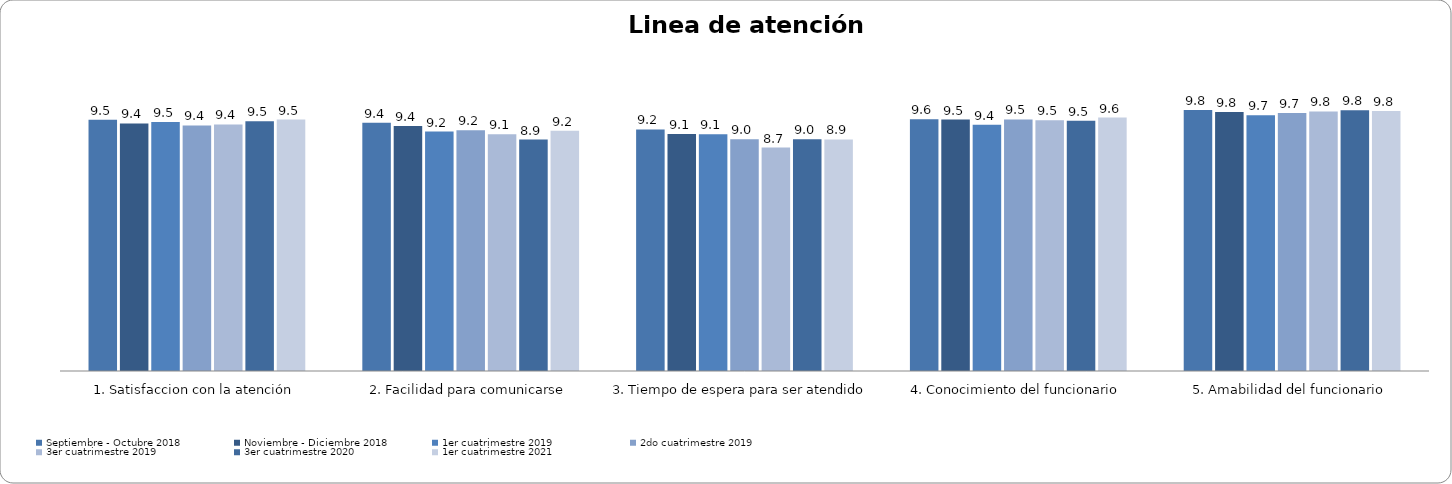
| Category | Septiembre - Octubre 2018 | Noviembre - Diciembre 2018 | 1er cuatrimestre 2019 | 2do cuatrimestre 2019 | 3er cuatrimestre 2019 | 3er cuatrimestre 2020 | 1er cuatrimestre 2021 |
|---|---|---|---|---|---|---|---|
| 1. Satisfaccion con la atención | 9.54 | 9.425 | 9.471 | 9.366 | 9.397 | 9.495 | 9.543 |
| 2. Facilidad para comunicarse | 9.448 | 9.353 | 9.182 | 9.219 | 9.102 | 8.944 | 9.206 |
| 3. Tiempo de espera para ser atendido | 9.249 | 9.112 | 9.102 | 8.955 | 8.704 | 8.955 | 8.947 |
| 4. Conocimiento del funcionario | 9.556 | 9.543 | 9.39 | 9.545 | 9.522 | 9.505 | 9.604 |
| 5. Amabilidad del funcionario | 9.832 | 9.767 | 9.674 | 9.738 | 9.786 | 9.824 | 9.797 |